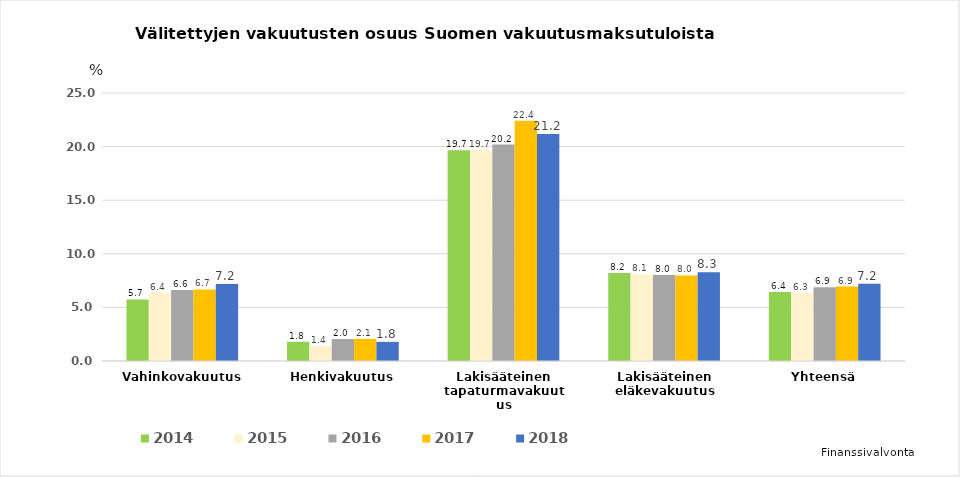
| Category | 2014 | 2015 | 2016 | 2017 | 2018 |
|---|---|---|---|---|---|
| Vahinkovakuutus | 5.737 | 6.356 | 6.621 | 6.681 | 7.184 |
| Henkivakuutus | 1.791 | 1.39 | 2.047 | 2.067 | 1.786 |
| Lakisääteinen tapaturmavakuutus | 19.654 | 19.692 | 20.194 | 22.408 | 21.186 |
| Lakisääteinen eläkevakuutus | 8.203 | 8.075 | 8.016 | 7.982 | 8.268 |
| Yhteensä | 6.436 | 6.337 | 6.875 | 6.948 | 7.208 |